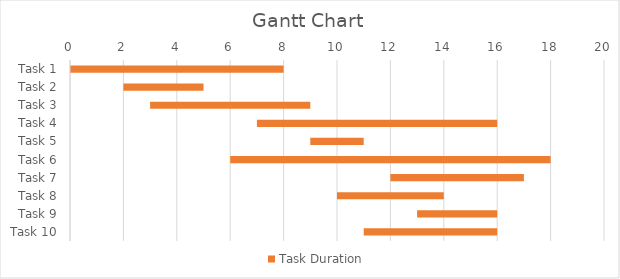
| Category | Series 0 | Task Duration |
|---|---|---|
| Task 1 | 0 | 8 |
| Task 2 | 2 | 3 |
| Task 3 | 3 | 6 |
| Task 4 | 7 | 9 |
| Task 5 | 9 | 2 |
| Task 6 | 6 | 12 |
| Task 7 | 12 | 5 |
| Task 8 | 10 | 4 |
| Task 9 | 13 | 3 |
| Task 10 | 11 | 5 |